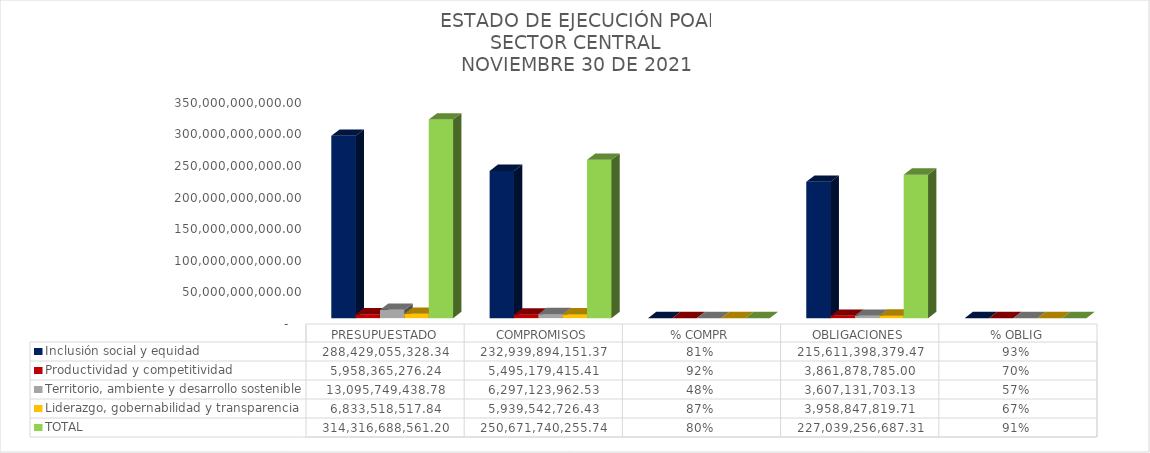
| Category | Inclusión social y equidad | Productividad y competitividad | Territorio, ambiente y desarrollo sostenible | Liderazgo, gobernabilidad y transparencia | TOTAL |
|---|---|---|---|---|---|
|  PRESUPUESTADO  | 288429055328.34 | 5958365276.24 | 13095749438.78 | 6833518517.84 | 314316688561.2 |
|  COMPROMISOS  | 232939894151.37 | 5495179415.41 | 6297123962.53 | 5939542726.43 | 250671740255.74 |
|  % COMPR  | 0.808 | 0.922 | 0.481 | 0.869 | 0.798 |
|  OBLIGACIONES  | 215611398379.47 | 3861878785 | 3607131703.13 | 3958847819.71 | 227039256687.31 |
|  % OBLIG  | 0.926 | 0.703 | 0.573 | 0.667 | 0.906 |